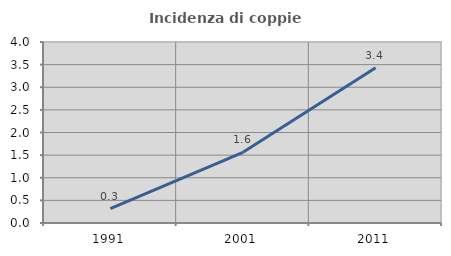
| Category | Incidenza di coppie miste |
|---|---|
| 1991.0 | 0.318 |
| 2001.0 | 1.562 |
| 2011.0 | 3.429 |